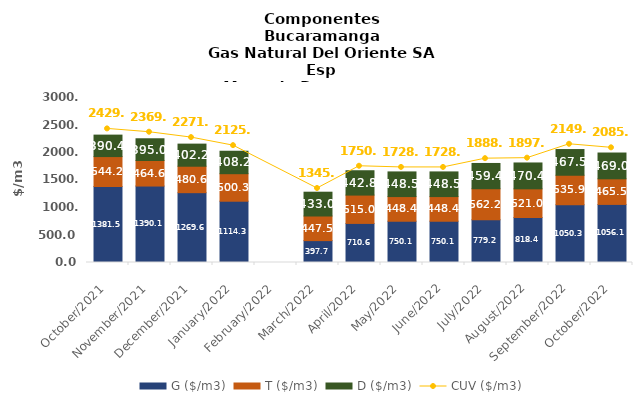
| Category | G ($/m3) | T ($/m3) | D ($/m3) |
|---|---|---|---|
| 2021-10-01 | 1381.54 | 544.2 | 390.35 |
| 2021-11-01 | 1390.06 | 464.56 | 395.01 |
| 2021-12-01 | 1269.62 | 480.62 | 402.17 |
| 2022-01-01 | 1114.28 | 500.33 | 408.24 |
| 2022-03-01 | 397.74 | 447.53 | 433 |
| 2022-04-01 | 710.63 | 514.96 | 442.77 |
| 2022-05-01 | 750.14 | 448.38 | 448.47 |
| 2022-06-01 | 750.14 | 448.38 | 448.47 |
| 2022-07-01 | 779.21 | 562.18 | 459.39 |
| 2022-08-01 | 818.35 | 520.99 | 470.4 |
| 2022-09-01 | 1050.31 | 535.9 | 467.52 |
| 2022-10-01 | 1056.07 | 465.54 | 469.03 |